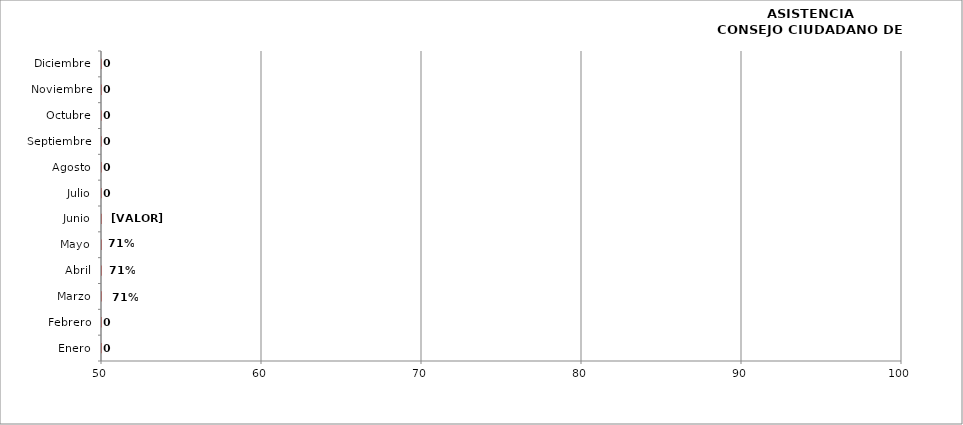
| Category | Series 1 |
|---|---|
| Enero | 0 |
| Febrero | 0 |
| Marzo | 0 |
| Abril | 0 |
| Mayo | 0 |
| Junio | 0 |
| Julio | 0 |
| Agosto | 0 |
| Septiembre | 0 |
| Octubre | 0 |
| Noviembre | 0 |
| Diciembre | 0 |